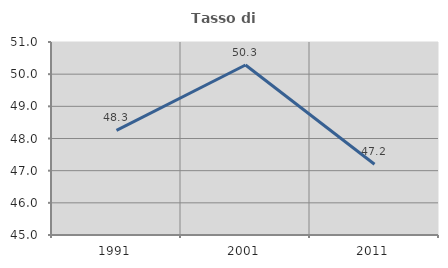
| Category | Tasso di occupazione   |
|---|---|
| 1991.0 | 48.253 |
| 2001.0 | 50.285 |
| 2011.0 | 47.199 |